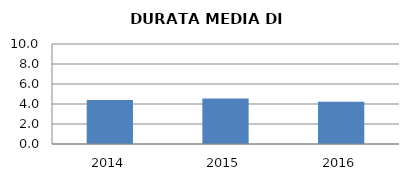
| Category | 2014 2015 2016 |
|---|---|
| 2014.0 | 4.4 |
| 2015.0 | 4.538 |
| 2016.0 | 4.217 |